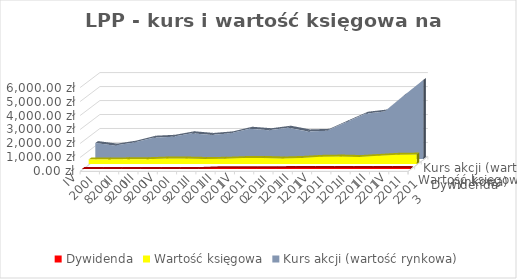
| Category | Dywidenda | Wartość księgowa | Kurs akcji (wartość rynkowa) |
|---|---|---|---|
| IV 2008 | 0 | 322.991 | 1140 |
| I 2009 | 0 | 316.165 | 959.5 |
| II 2009 | 0 | 334.77 | 1175 |
| III 2009 | 0 | 343.892 | 1525 |
| IV 2009 | 0 | 391.765 | 1590 |
| I 2010 | 0 | 389.528 | 1841.5 |
| II 2010 | 0 | 359.121 | 1722 |
| III 2010 | 50 | 369.747 | 1835 |
| IV 2010 | 50 | 420.883 | 2165 |
| I 2011 | 50 | 434.848 | 2060 |
| II 2011 | 50 | 393.022 | 2240 |
| III 2011 | 76.86 | 435.215 | 1975 |
| IV 2011 | 76.86 | 510.783 | 2016 |
| I 2012 | 76.86 | 533.025 | 2635 |
| II 2012 | 76.86 | 498.579 | 3240.5 |
| III 2012 | 77.36 | 581.338 | 3400 |
| IV 2012 | 77.36 | 662.358 | 4550 |
| I 2013 | 77.36 | 673.436 | 5650 |